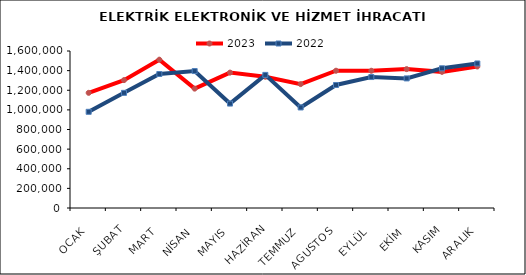
| Category | 2023 | 2022 |
|---|---|---|
| OCAK | 1173646.883 | 980374.201 |
| ŞUBAT | 1303248.945 | 1173474.299 |
| MART | 1511701.595 | 1365457.372 |
| NİSAN | 1216439.662 | 1395609.227 |
| MAYIS | 1379798.989 | 1064241.482 |
| HAZİRAN | 1337391.323 | 1356579.684 |
| TEMMUZ | 1262503.819 | 1024625.661 |
| AGUSTOS | 1399062.53 | 1253638.016 |
| EYLÜL | 1398572.241 | 1334609.636 |
| EKİM | 1415306.777 | 1320585.239 |
| KASIM | 1387329.702 | 1423777.368 |
| ARALIK | 1442064.599 | 1472989.666 |